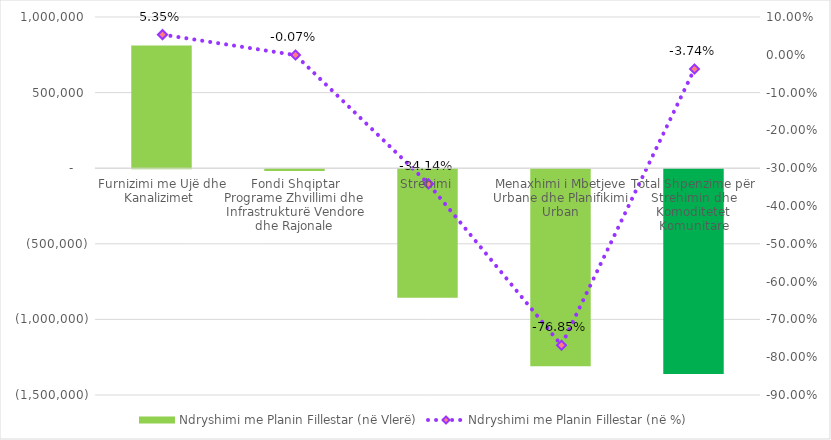
| Category | Ndryshimi me Planin Fillestar (në Vlerë) |
|---|---|
| Furnizimi me Ujë dhe Kanalizimet  | 810900 |
| Fondi Shqiptar Programe Zhvillimi dhe Infrastrukturë Vendore dhe Rajonale | -11400 |
| Strehimi | -850000 |
| Menaxhimi i Mbetjeve Urbane dhe Planifikimi Urban | -1303363 |
| Total Shpenzime për Strehimin dhe Komoditetet Komunitare | -1353863 |